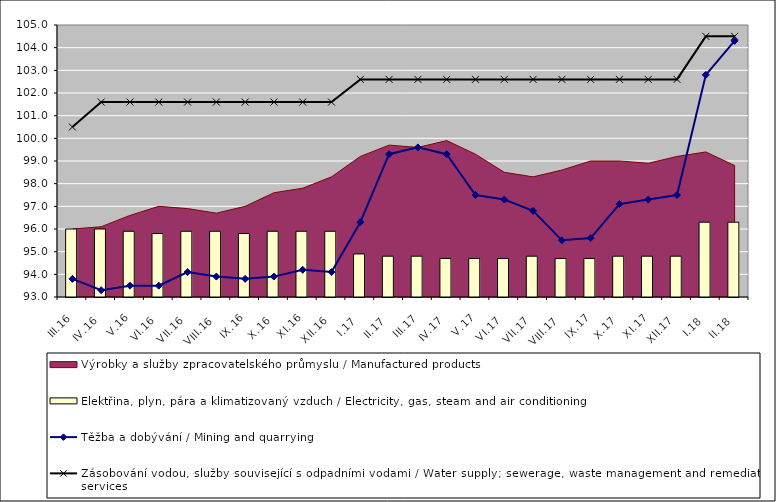
| Category | Elektřina, plyn, pára a klimatizovaný vzduch / Electricity, gas, steam and air conditioning |
|---|---|
| III.16 | 96 |
| IV.16 | 96 |
| V.16 | 95.9 |
| VI.16 | 95.8 |
| VII.16 | 95.9 |
| VIII.16 | 95.9 |
| IX.16 | 95.8 |
| X.16 | 95.9 |
| XI.16 | 95.9 |
| XII.16 | 95.9 |
| I.17 | 94.9 |
| II.17 | 94.8 |
| III.17 | 94.8 |
| IV.17 | 94.7 |
| V.17 | 94.7 |
| VI.17 | 94.7 |
| VII.17 | 94.8 |
| VIII.17 | 94.7 |
| IX.17 | 94.7 |
| X.17 | 94.8 |
| XI.17 | 94.8 |
| XII.17 | 94.8 |
| I.18 | 96.3 |
| II.18 | 96.3 |